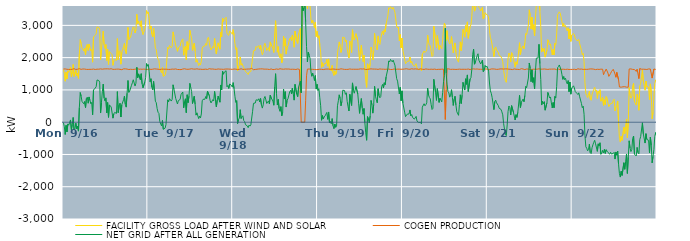
| Category | FACILITY GROSS LOAD AFTER WIND AND SOLAR | COGEN PRODUCTION | NET GRID AFTER ALL GENERATION |
|---|---|---|---|
|  Mon  9/16 | 1635 | 1648 | -13 |
|  Mon  9/16 | 1512 | 1654 | -142 |
|  Mon  9/16 | 1269 | 1650 | -381 |
|  Mon  9/16 | 1549 | 1647 | -98 |
|  Mon  9/16 | 1337 | 1639 | -302 |
|  Mon  9/16 | 1593 | 1647 | -54 |
|  Mon  9/16 | 1542 | 1635 | -93 |
|  Mon  9/16 | 1534 | 1640 | -106 |
|  Mon  9/16 | 1702 | 1633 | 69 |
|  Mon  9/16 | 1405 | 1639 | -234 |
|  Mon  9/16 | 1570 | 1639 | -69 |
|  Mon  9/16 | 1789 | 1643 | 146 |
|  Mon  9/16 | 1416 | 1657 | -241 |
|  Mon  9/16 | 1430 | 1639 | -209 |
|  Mon  9/16 | 1604 | 1634 | -30 |
|  Mon  9/16 | 1434 | 1642 | -208 |
|  Mon  9/16 | 1516 | 1641 | -125 |
|  Mon  9/16 | 1357 | 1634 | -277 |
|  Mon  9/16 | 2112 | 1658 | 454 |
|  Mon  9/16 | 2558 | 1640 | 918 |
|  Mon  9/16 | 2441 | 1637 | 804 |
|  Mon  9/16 | 2297 | 1653 | 644 |
|  Mon  9/16 | 2287 | 1648 | 639 |
|  Mon  9/16 | 2205 | 1635 | 570 |
|  Mon  9/16 | 2286 | 1646 | 640 |
|  Mon  9/16 | 2090 | 1638 | 452 |
|  Mon  9/16 | 2374 | 1636 | 738 |
|  Mon  9/16 | 2413 | 1638 | 775 |
|  Mon  9/16 | 2223 | 1635 | 588 |
|  Mon  9/16 | 2420 | 1638 | 782 |
|  Mon  9/16 | 2309 | 1638 | 671 |
|  Mon  9/16 | 2213 | 1642 | 571 |
|  Mon  9/16 | 2251 | 1638 | 613 |
|  Mon  9/16 | 1859 | 1630 | 229 |
|  Mon  9/16 | 2643 | 1646 | 997 |
|  Mon  9/16 | 2626 | 1638 | 988 |
|  Mon  9/16 | 2691 | 1633 | 1058 |
|  Mon  9/16 | 2742 | 1644 | 1098 |
|  Mon  9/16 | 2951 | 1643 | 1308 |
|  Mon  9/16 | 2958 | 1640 | 1318 |
|  Mon  9/16 | 2932 | 1642 | 1290 |
|  Mon  9/16 | 2885 | 1643 | 1242 |
|  Mon  9/16 | 1935 | 1651 | 284 |
|  Mon  9/16 | 2251 | 1639 | 612 |
|  Mon  9/16 | 2583 | 1642 | 941 |
|  Mon  9/16 | 2820 | 1641 | 1179 |
|  Mon  9/16 | 2399 | 1650 | 749 |
|  Mon  9/16 | 2287 | 1633 | 654 |
|  Mon  9/16 | 2406 | 1652 | 754 |
|  Mon  9/16 | 1914 | 1627 | 287 |
|  Mon  9/16 | 2262 | 1653 | 609 |
|  Mon  9/16 | 1790 | 1640 | 150 |
|  Mon  9/16 | 2183 | 1647 | 536 |
|  Mon  9/16 | 2206 | 1654 | 552 |
|  Mon  9/16 | 2127 | 1656 | 471 |
|  Mon  9/16 | 2092 | 1639 | 453 |
|  Mon  9/16 | 1762 | 1637 | 125 |
|  Mon  9/16 | 1904 | 1646 | 258 |
|  Mon  9/16 | 1943 | 1639 | 304 |
|  Mon  9/16 | 1921 | 1635 | 286 |
|  Mon  9/16 | 1913 | 1643 | 270 |
|  Mon  9/16 | 2591 | 1644 | 947 |
|  Mon  9/16 | 1941 | 1645 | 296 |
|  Mon  9/16 | 2190 | 1660 | 530 |
|  Mon  9/16 | 2224 | 1638 | 586 |
|  Mon  9/16 | 1796 | 1636 | 160 |
|  Mon  9/16 | 2166 | 1627 | 539 |
|  Mon  9/16 | 2156 | 1641 | 515 |
|  Mon  9/16 | 2345 | 1651 | 694 |
|  Mon  9/16 | 2442 | 1635 | 807 |
|  Mon  9/16 | 2205 | 1652 | 553 |
|  Mon  9/16 | 2121 | 1654 | 467 |
|  Mon  9/16 | 2543 | 1645 | 898 |
|  Mon  9/16 | 2936 | 1645 | 1291 |
|  Mon  9/16 | 2556 | 1632 | 924 |
|  Mon  9/16 | 2608 | 1638 | 970 |
|  Mon  9/16 | 2639 | 1640 | 999 |
|  Mon  9/16 | 2778 | 1634 | 1144 |
|  Mon  9/16 | 2855 | 1634 | 1221 |
|  Mon  9/16 | 2957 | 1643 | 1314 |
|  Mon  9/16 | 2922 | 1637 | 1285 |
|  Mon  9/16 | 2763 | 1643 | 1120 |
|  Mon  9/16 | 2854 | 1647 | 1207 |
|  Mon  9/16 | 3343 | 1643 | 1700 |
|  Mon  9/16 | 3051 | 1673 | 1378 |
|  Mon  9/16 | 3136 | 1639 | 1497 |
|  Mon  9/16 | 3154 | 1640 | 1514 |
|  Mon  9/16 | 2962 | 1644 | 1318 |
|  Mon  9/16 | 3141 | 1639 | 1502 |
|  Mon  9/16 | 2827 | 1640 | 1187 |
|  Mon  9/16 | 2710 | 1645 | 1065 |
|  Mon  9/16 | 2720 | 1645 | 1075 |
|  Mon  9/16 | 2881 | 1640 | 1241 |
|  Mon  9/16 | 3022 | 1638 | 1384 |
|  Mon  9/16 | 3458 | 1642 | 1816 |
|  Mon  9/16 | 3369 | 1633 | 1736 |
|  Tue  9/17 | 3415 | 1630 | 1785 |
|  Tue  9/17 | 3208 | 1646 | 1562 |
|  Tue  9/17 | 2893 | 1639 | 1254 |
|  Tue  9/17 | 2981 | 1635 | 1346 |
|  Tue  9/17 | 2731 | 1645 | 1086 |
|  Tue  9/17 | 2648 | 1642 | 1006 |
|  Tue  9/17 | 2908 | 1646 | 1262 |
|  Tue  9/17 | 2622 | 1653 | 969 |
|  Tue  9/17 | 2291 | 1640 | 651 |
|  Tue  9/17 | 2251 | 1647 | 604 |
|  Tue  9/17 | 2056 | 1634 | 422 |
|  Tue  9/17 | 1951 | 1643 | 308 |
|  Tue  9/17 | 1912 | 1642 | 270 |
|  Tue  9/17 | 1656 | 1633 | 23 |
|  Tue  9/17 | 1633 | 1637 | -4 |
|  Tue  9/17 | 1527 | 1643 | -116 |
|  Tue  9/17 | 1696 | 1642 | 54 |
|  Tue  9/17 | 1423 | 1643 | -220 |
|  Tue  9/17 | 1435 | 1640 | -205 |
|  Tue  9/17 | 1457 | 1642 | -185 |
|  Tue  9/17 | 1579 | 1651 | -72 |
|  Tue  9/17 | 1599 | 1641 | -42 |
|  Tue  9/17 | 2322 | 1630 | 692 |
|  Tue  9/17 | 2266 | 1635 | 631 |
|  Tue  9/17 | 2377 | 1648 | 729 |
|  Tue  9/17 | 2348 | 1636 | 712 |
|  Tue  9/17 | 2305 | 1651 | 654 |
|  Tue  9/17 | 2353 | 1645 | 708 |
|  Tue  9/17 | 2798 | 1640 | 1158 |
|  Tue  9/17 | 2667 | 1642 | 1025 |
|  Tue  9/17 | 2668 | 1650 | 1018 |
|  Tue  9/17 | 2387 | 1650 | 737 |
|  Tue  9/17 | 2406 | 1644 | 762 |
|  Tue  9/17 | 2196 | 1633 | 563 |
|  Tue  9/17 | 2307 | 1638 | 669 |
|  Tue  9/17 | 2308 | 1631 | 677 |
|  Tue  9/17 | 2350 | 1646 | 704 |
|  Tue  9/17 | 2483 | 1629 | 854 |
|  Tue  9/17 | 2479 | 1644 | 835 |
|  Tue  9/17 | 2581 | 1646 | 935 |
|  Tue  9/17 | 2076 | 1631 | 445 |
|  Tue  9/17 | 2296 | 1655 | 641 |
|  Tue  9/17 | 2359 | 1634 | 725 |
|  Tue  9/17 | 1936 | 1641 | 295 |
|  Tue  9/17 | 2496 | 1646 | 850 |
|  Tue  9/17 | 2244 | 1639 | 605 |
|  Tue  9/17 | 2453 | 1647 | 806 |
|  Tue  9/17 | 2847 | 1645 | 1202 |
|  Tue  9/17 | 2711 | 1637 | 1074 |
|  Tue  9/17 | 2605 | 1656 | 949 |
|  Tue  9/17 | 2223 | 1645 | 578 |
|  Tue  9/17 | 2250 | 1645 | 605 |
|  Tue  9/17 | 2443 | 1641 | 802 |
|  Tue  9/17 | 2197 | 1644 | 553 |
|  Tue  9/17 | 1861 | 1642 | 219 |
|  Tue  9/17 | 1942 | 1653 | 289 |
|  Tue  9/17 | 1943 | 1644 | 299 |
|  Tue  9/17 | 1753 | 1642 | 111 |
|  Tue  9/17 | 1832 | 1640 | 192 |
|  Tue  9/17 | 1771 | 1642 | 129 |
|  Tue  9/17 | 1896 | 1642 | 254 |
|  Tue  9/17 | 2300 | 1636 | 664 |
|  Tue  9/17 | 2347 | 1638 | 709 |
|  Tue  9/17 | 2377 | 1638 | 739 |
|  Tue  9/17 | 2362 | 1652 | 710 |
|  Tue  9/17 | 2439 | 1644 | 795 |
|  Tue  9/17 | 2382 | 1652 | 730 |
|  Tue  9/17 | 2593 | 1634 | 959 |
|  Tue  9/17 | 2629 | 1644 | 985 |
|  Tue  9/17 | 2476 | 1658 | 818 |
|  Tue  9/17 | 2313 | 1650 | 663 |
|  Tue  9/17 | 2243 | 1646 | 597 |
|  Tue  9/17 | 2262 | 1644 | 618 |
|  Tue  9/17 | 2346 | 1648 | 698 |
|  Tue  9/17 | 2298 | 1637 | 661 |
|  Tue  9/17 | 2593 | 1640 | 953 |
|  Tue  9/17 | 2606 | 1638 | 968 |
|  Tue  9/17 | 2112 | 1637 | 475 |
|  Tue  9/17 | 2334 | 1650 | 684 |
|  Tue  9/17 | 2458 | 1649 | 809 |
|  Tue  9/17 | 2437 | 1635 | 802 |
|  Tue  9/17 | 2263 | 1643 | 620 |
|  Tue  9/17 | 2789 | 1636 | 1153 |
|  Tue  9/17 | 2639 | 1642 | 997 |
|  Tue  9/17 | 3223 | 1644 | 1579 |
|  Tue  9/17 | 3123 | 1637 | 1486 |
|  Tue  9/17 | 3192 | 1641 | 1551 |
|  Tue  9/17 | 3170 | 1645 | 1525 |
|  Tue  9/17 | 3249 | 1656 | 1593 |
|  Tue  9/17 | 2744 | 1647 | 1097 |
|  Tue  9/17 | 2768 | 1633 | 1135 |
|  Tue  9/17 | 2690 | 1645 | 1045 |
|  Tue  9/17 | 2824 | 1642 | 1182 |
|  Tue  9/17 | 2798 | 1642 | 1156 |
|  Tue  9/17 | 2779 | 1633 | 1146 |
|  Tue  9/17 | 2724 | 1637 | 1087 |
|  Wed  9/18 | 2868 | 1642 | 1226 |
|  Wed  9/18 | 2689 | 1647 | 1042 |
|  Wed  9/18 | 2442 | 1639 | 803 |
|  Wed  9/18 | 2254 | 1642 | 612 |
|  Wed  9/18 | 2306 | 1637 | 669 |
|  Wed  9/18 | 1591 | 1635 | -44 |
|  Wed  9/18 | 1713 | 1635 | 78 |
|  Wed  9/18 | 1767 | 1638 | 129 |
|  Wed  9/18 | 2021 | 1634 | 387 |
|  Wed  9/18 | 1767 | 1655 | 112 |
|  Wed  9/18 | 1816 | 1650 | 166 |
|  Wed  9/18 | 1834 | 1636 | 198 |
|  Wed  9/18 | 1686 | 1636 | 50 |
|  Wed  9/18 | 1656 | 1640 | 16 |
|  Wed  9/18 | 1569 | 1648 | -79 |
|  Wed  9/18 | 1571 | 1643 | -72 |
|  Wed  9/18 | 1522 | 1637 | -115 |
|  Wed  9/18 | 1477 | 1647 | -170 |
|  Wed  9/18 | 1551 | 1642 | -91 |
|  Wed  9/18 | 1525 | 1647 | -122 |
|  Wed  9/18 | 1571 | 1653 | -82 |
|  Wed  9/18 | 1591 | 1667 | -76 |
|  Wed  9/18 | 1982 | 1644 | 338 |
|  Wed  9/18 | 2210 | 1626 | 584 |
|  Wed  9/18 | 2224 | 1645 | 579 |
|  Wed  9/18 | 2228 | 1634 | 594 |
|  Wed  9/18 | 2344 | 1651 | 693 |
|  Wed  9/18 | 2312 | 1642 | 670 |
|  Wed  9/18 | 2326 | 1646 | 680 |
|  Wed  9/18 | 2374 | 1648 | 726 |
|  Wed  9/18 | 2268 | 1641 | 627 |
|  Wed  9/18 | 2385 | 1651 | 734 |
|  Wed  9/18 | 2197 | 1659 | 538 |
|  Wed  9/18 | 2088 | 1652 | 436 |
|  Wed  9/18 | 2172 | 1636 | 536 |
|  Wed  9/18 | 2381 | 1644 | 737 |
|  Wed  9/18 | 2446 | 1649 | 797 |
|  Wed  9/18 | 2335 | 1644 | 691 |
|  Wed  9/18 | 2222 | 1641 | 581 |
|  Wed  9/18 | 2239 | 1642 | 597 |
|  Wed  9/18 | 2310 | 1650 | 660 |
|  Wed  9/18 | 2200 | 1632 | 568 |
|  Wed  9/18 | 2487 | 1648 | 839 |
|  Wed  9/18 | 2401 | 1650 | 751 |
|  Wed  9/18 | 2406 | 1634 | 772 |
|  Wed  9/18 | 2284 | 1629 | 655 |
|  Wed  9/18 | 2160 | 1635 | 525 |
|  Wed  9/18 | 2728 | 1635 | 1093 |
|  Wed  9/18 | 3143 | 1641 | 1502 |
|  Wed  9/18 | 2538 | 1648 | 890 |
|  Wed  9/18 | 2169 | 1638 | 531 |
|  Wed  9/18 | 2342 | 1637 | 705 |
|  Wed  9/18 | 2061 | 1639 | 422 |
|  Wed  9/18 | 1994 | 1656 | 338 |
|  Wed  9/18 | 2121 | 1640 | 481 |
|  Wed  9/18 | 1843 | 1645 | 198 |
|  Wed  9/18 | 1940 | 1631 | 309 |
|  Wed  9/18 | 2666 | 1641 | 1025 |
|  Wed  9/18 | 2357 | 1640 | 717 |
|  Wed  9/18 | 2594 | 1649 | 945 |
|  Wed  9/18 | 2110 | 1641 | 469 |
|  Wed  9/18 | 2324 | 1646 | 678 |
|  Wed  9/18 | 2364 | 1638 | 726 |
|  Wed  9/18 | 2359 | 1647 | 712 |
|  Wed  9/18 | 2592 | 1648 | 944 |
|  Wed  9/18 | 2624 | 1638 | 986 |
|  Wed  9/18 | 2531 | 1651 | 880 |
|  Wed  9/18 | 2698 | 1641 | 1057 |
|  Wed  9/18 | 2533 | 1651 | 882 |
|  Wed  9/18 | 2322 | 1639 | 683 |
|  Wed  9/18 | 2823 | 1652 | 1171 |
|  Wed  9/18 | 2805 | 1632 | 1173 |
|  Wed  9/18 | 2509 | 1645 | 864 |
|  Wed  9/18 | 2438 | 1649 | 789 |
|  Wed  9/18 | 2732 | 1644 | 1088 |
|  Wed  9/18 | 2706 | 1635 | 1071 |
|  Wed  9/18 | 2902 | 1633 | 1269 |
|  Wed  9/18 | 911 | 0 | 911 |
|  Wed  9/18 | 3665 | 0 | 3665 |
|  Wed  9/18 | 3449 | 0 | 3449 |
|  Wed  9/18 | 3541 | 0 | 3541 |
|  Wed  9/18 | 3788 | 0 | 3788 |
|  Wed  9/18 | 3774 | 664 | 3110 |
|  Wed  9/18 | 3783 | 1436 | 2347 |
|  Wed  9/18 | 3515 | 1645 | 1870 |
|  Wed  9/18 | 3806 | 1639 | 2167 |
|  Wed  9/18 | 3717 | 1647 | 2070 |
|  Wed  9/18 | 3614 | 1634 | 1980 |
|  Wed  9/18 | 3199 | 1640 | 1559 |
|  Wed  9/18 | 3070 | 1647 | 1423 |
|  Wed  9/18 | 3158 | 1637 | 1521 |
|  Wed  9/18 | 3055 | 1636 | 1419 |
|  Wed  9/18 | 2924 | 1633 | 1291 |
|  Wed  9/18 | 3096 | 1653 | 1443 |
|  Wed  9/18 | 2654 | 1628 | 1026 |
|  Wed  9/18 | 2818 | 1646 | 1172 |
|  Thu  9/19 | 2614 | 1633 | 981 |
|  Thu  9/19 | 2680 | 1645 | 1035 |
|  Thu  9/19 | 2398 | 1642 | 756 |
|  Thu  9/19 | 2162 | 1654 | 508 |
|  Thu  9/19 | 1697 | 1639 | 58 |
|  Thu  9/19 | 1844 | 1638 | 206 |
|  Thu  9/19 | 1728 | 1630 | 98 |
|  Thu  9/19 | 1811 | 1647 | 164 |
|  Thu  9/19 | 1839 | 1643 | 196 |
|  Thu  9/19 | 1827 | 1650 | 177 |
|  Thu  9/19 | 1948 | 1646 | 302 |
|  Thu  9/19 | 1736 | 1648 | 88 |
|  Thu  9/19 | 1961 | 1645 | 316 |
|  Thu  9/19 | 1625 | 1650 | -25 |
|  Thu  9/19 | 1662 | 1639 | 23 |
|  Thu  9/19 | 1589 | 1636 | -47 |
|  Thu  9/19 | 1757 | 1646 | 111 |
|  Thu  9/19 | 1529 | 1641 | -112 |
|  Thu  9/19 | 1447 | 1646 | -199 |
|  Thu  9/19 | 1590 | 1647 | -57 |
|  Thu  9/19 | 1479 | 1638 | -159 |
|  Thu  9/19 | 1523 | 1643 | -120 |
|  Thu  9/19 | 2147 | 1638 | 509 |
|  Thu  9/19 | 2308 | 1644 | 664 |
|  Thu  9/19 | 2487 | 1639 | 848 |
|  Thu  9/19 | 2368 | 1632 | 736 |
|  Thu  9/19 | 2161 | 1654 | 507 |
|  Thu  9/19 | 2285 | 1643 | 642 |
|  Thu  9/19 | 2635 | 1645 | 990 |
|  Thu  9/19 | 2631 | 1630 | 1001 |
|  Thu  9/19 | 2616 | 1636 | 980 |
|  Thu  9/19 | 2493 | 1630 | 863 |
|  Thu  9/19 | 2546 | 1635 | 911 |
|  Thu  9/19 | 2274 | 1629 | 645 |
|  Thu  9/19 | 2116 | 1637 | 479 |
|  Thu  9/19 | 1988 | 1641 | 347 |
|  Thu  9/19 | 2511 | 1649 | 862 |
|  Thu  9/19 | 2478 | 1642 | 836 |
|  Thu  9/19 | 2159 | 1640 | 519 |
|  Thu  9/19 | 2864 | 1647 | 1217 |
|  Thu  9/19 | 2632 | 1641 | 991 |
|  Thu  9/19 | 2542 | 1645 | 897 |
|  Thu  9/19 | 2564 | 1640 | 924 |
|  Thu  9/19 | 2744 | 1640 | 1104 |
|  Thu  9/19 | 2743 | 1640 | 1103 |
|  Thu  9/19 | 2524 | 1651 | 873 |
|  Thu  9/19 | 2208 | 1641 | 567 |
|  Thu  9/19 | 1908 | 1634 | 274 |
|  Thu  9/19 | 2217 | 1652 | 565 |
|  Thu  9/19 | 2384 | 1651 | 733 |
|  Thu  9/19 | 2090 | 1646 | 444 |
|  Thu  9/19 | 1877 | 1630 | 247 |
|  Thu  9/19 | 2075 | 1651 | 424 |
|  Thu  9/19 | 1628 | 1648 | -20 |
|  Thu  9/19 | 1301 | 1631 | -330 |
|  Thu  9/19 | 1079 | 1640 | -561 |
|  Thu  9/19 | 1809 | 1637 | 172 |
|  Thu  9/19 | 1736 | 1634 | 102 |
|  Thu  9/19 | 1626 | 1646 | -20 |
|  Thu  9/19 | 1828 | 1635 | 193 |
|  Thu  9/19 | 2326 | 1652 | 674 |
|  Thu  9/19 | 2181 | 1641 | 540 |
|  Thu  9/19 | 1926 | 1646 | 280 |
|  Thu  9/19 | 2194 | 1647 | 547 |
|  Thu  9/19 | 2755 | 1645 | 1110 |
|  Thu  9/19 | 2455 | 1650 | 805 |
|  Thu  9/19 | 2339 | 1644 | 695 |
|  Thu  9/19 | 2242 | 1640 | 602 |
|  Thu  9/19 | 2673 | 1636 | 1037 |
|  Thu  9/19 | 2465 | 1640 | 825 |
|  Thu  9/19 | 2407 | 1650 | 757 |
|  Thu  9/19 | 2436 | 1641 | 795 |
|  Thu  9/19 | 2747 | 1643 | 1104 |
|  Thu  9/19 | 2820 | 1650 | 1170 |
|  Thu  9/19 | 2703 | 1643 | 1060 |
|  Thu  9/19 | 2867 | 1644 | 1223 |
|  Thu  9/19 | 2796 | 1638 | 1158 |
|  Thu  9/19 | 3042 | 1643 | 1399 |
|  Thu  9/19 | 3029 | 1643 | 1386 |
|  Thu  9/19 | 3287 | 1635 | 1652 |
|  Thu  9/19 | 3545 | 1646 | 1899 |
|  Thu  9/19 | 3513 | 1647 | 1866 |
|  Thu  9/19 | 3577 | 1633 | 1944 |
|  Thu  9/19 | 3550 | 1643 | 1907 |
|  Thu  9/19 | 3501 | 1632 | 1869 |
|  Thu  9/19 | 3559 | 1637 | 1922 |
|  Thu  9/19 | 3491 | 1648 | 1843 |
|  Thu  9/19 | 3404 | 1639 | 1765 |
|  Thu  9/19 | 3393 | 1637 | 1756 |
|  Thu  9/19 | 2980 | 1632 | 1348 |
|  Thu  9/19 | 2916 | 1644 | 1272 |
|  Thu  9/19 | 2950 | 1649 | 1301 |
|  Thu  9/19 | 2518 | 1643 | 875 |
|  Thu  9/19 | 2717 | 1638 | 1079 |
|  Thu  9/19 | 2304 | 1640 | 664 |
|  Thu  9/19 | 2605 | 1634 | 971 |
|  Fri  9/20 | 2236 | 1641 | 595 |
|  Fri  9/20 | 2216 | 1643 | 573 |
|  Fri  9/20 | 1959 | 1647 | 312 |
|  Fri  9/20 | 1814 | 1642 | 172 |
|  Fri  9/20 | 1835 | 1656 | 179 |
|  Fri  9/20 | 1887 | 1637 | 250 |
|  Fri  9/20 | 1916 | 1643 | 273 |
|  Fri  9/20 | 1893 | 1638 | 255 |
|  Fri  9/20 | 2018 | 1639 | 379 |
|  Fri  9/20 | 1832 | 1635 | 197 |
|  Fri  9/20 | 1891 | 1655 | 236 |
|  Fri  9/20 | 1786 | 1641 | 145 |
|  Fri  9/20 | 1774 | 1645 | 129 |
|  Fri  9/20 | 1733 | 1638 | 95 |
|  Fri  9/20 | 1718 | 1651 | 67 |
|  Fri  9/20 | 1813 | 1634 | 179 |
|  Fri  9/20 | 1678 | 1647 | 31 |
|  Fri  9/20 | 1667 | 1654 | 13 |
|  Fri  9/20 | 1625 | 1637 | -12 |
|  Fri  9/20 | 1597 | 1618 | -21 |
|  Fri  9/20 | 1653 | 1652 | 1 |
|  Fri  9/20 | 1595 | 1647 | -52 |
|  Fri  9/20 | 2108 | 1641 | 467 |
|  Fri  9/20 | 2091 | 1642 | 449 |
|  Fri  9/20 | 2206 | 1634 | 572 |
|  Fri  9/20 | 2159 | 1651 | 508 |
|  Fri  9/20 | 2190 | 1650 | 540 |
|  Fri  9/20 | 2238 | 1637 | 601 |
|  Fri  9/20 | 2697 | 1641 | 1056 |
|  Fri  9/20 | 2482 | 1638 | 844 |
|  Fri  9/20 | 2399 | 1637 | 762 |
|  Fri  9/20 | 2365 | 1640 | 725 |
|  Fri  9/20 | 2185 | 1643 | 542 |
|  Fri  9/20 | 2032 | 1639 | 393 |
|  Fri  9/20 | 2067 | 1637 | 430 |
|  Fri  9/20 | 2975 | 1647 | 1328 |
|  Fri  9/20 | 2955 | 1645 | 1310 |
|  Fri  9/20 | 2570 | 1650 | 920 |
|  Fri  9/20 | 2306 | 1631 | 675 |
|  Fri  9/20 | 2682 | 1643 | 1039 |
|  Fri  9/20 | 2694 | 1638 | 1056 |
|  Fri  9/20 | 2252 | 1638 | 614 |
|  Fri  9/20 | 2380 | 1638 | 742 |
|  Fri  9/20 | 2396 | 1649 | 747 |
|  Fri  9/20 | 2271 | 1642 | 629 |
|  Fri  9/20 | 2557 | 1644 | 913 |
|  Fri  9/20 | 2901 | 1645 | 1256 |
|  Fri  9/20 | 3071 | 1635 | 1436 |
|  Fri  9/20 | 2994 | 84 | 2910 |
|  Fri  9/20 | 2528 | 1014 | 1514 |
|  Fri  9/20 | 2835 | 1654 | 1181 |
|  Fri  9/20 | 2575 | 1627 | 948 |
|  Fri  9/20 | 2559 | 1650 | 909 |
|  Fri  9/20 | 2423 | 1648 | 775 |
|  Fri  9/20 | 2471 | 1636 | 835 |
|  Fri  9/20 | 2653 | 1647 | 1006 |
|  Fri  9/20 | 2411 | 1640 | 771 |
|  Fri  9/20 | 2148 | 1629 | 519 |
|  Fri  9/20 | 2351 | 1638 | 713 |
|  Fri  9/20 | 2455 | 1651 | 804 |
|  Fri  9/20 | 2167 | 1634 | 533 |
|  Fri  9/20 | 1965 | 1640 | 325 |
|  Fri  9/20 | 1967 | 1638 | 329 |
|  Fri  9/20 | 1859 | 1647 | 212 |
|  Fri  9/20 | 2192 | 1644 | 548 |
|  Fri  9/20 | 2489 | 1640 | 849 |
|  Fri  9/20 | 2216 | 1638 | 578 |
|  Fri  9/20 | 2477 | 1640 | 837 |
|  Fri  9/20 | 2875 | 1640 | 1235 |
|  Fri  9/20 | 2753 | 1650 | 1103 |
|  Fri  9/20 | 2634 | 1639 | 995 |
|  Fri  9/20 | 2994 | 1649 | 1345 |
|  Fri  9/20 | 2811 | 1638 | 1173 |
|  Fri  9/20 | 3108 | 1644 | 1464 |
|  Fri  9/20 | 2599 | 1647 | 952 |
|  Fri  9/20 | 2597 | 1631 | 966 |
|  Fri  9/20 | 2970 | 1630 | 1340 |
|  Fri  9/20 | 3013 | 1637 | 1376 |
|  Fri  9/20 | 3279 | 1645 | 1634 |
|  Fri  9/20 | 3738 | 1635 | 2103 |
|  Fri  9/20 | 3913 | 1651 | 2262 |
|  Fri  9/20 | 3441 | 1644 | 1797 |
|  Fri  9/20 | 3500 | 1644 | 1856 |
|  Fri  9/20 | 3472 | 1633 | 1839 |
|  Fri  9/20 | 3707 | 1648 | 2059 |
|  Fri  9/20 | 3757 | 1637 | 2120 |
|  Fri  9/20 | 3560 | 1640 | 1920 |
|  Fri  9/20 | 3528 | 1625 | 1903 |
|  Fri  9/20 | 3443 | 1641 | 1802 |
|  Fri  9/20 | 3457 | 1646 | 1811 |
|  Fri  9/20 | 3562 | 1639 | 1923 |
|  Fri  9/20 | 3198 | 1635 | 1563 |
|  Fri  9/20 | 3238 | 1640 | 1598 |
|  Fri  9/20 | 3394 | 1634 | 1760 |
|  Fri  9/20 | 3352 | 1650 | 1702 |
|  Fri  9/20 | 3380 | 1645 | 1735 |
|  Sat  9/21 | 3311 | 1642 | 1669 |
|  Sat  9/21 | 3231 | 1649 | 1582 |
|  Sat  9/21 | 2844 | 1630 | 1214 |
|  Sat  9/21 | 2621 | 1651 | 970 |
|  Sat  9/21 | 2545 | 1649 | 896 |
|  Sat  9/21 | 2393 | 1631 | 762 |
|  Sat  9/21 | 2386 | 1650 | 736 |
|  Sat  9/21 | 2033 | 1643 | 390 |
|  Sat  9/21 | 2284 | 1646 | 638 |
|  Sat  9/21 | 2332 | 1650 | 682 |
|  Sat  9/21 | 2237 | 1636 | 601 |
|  Sat  9/21 | 2234 | 1636 | 598 |
|  Sat  9/21 | 2152 | 1640 | 512 |
|  Sat  9/21 | 2063 | 1634 | 429 |
|  Sat  9/21 | 2066 | 1650 | 416 |
|  Sat  9/21 | 2037 | 1640 | 397 |
|  Sat  9/21 | 1971 | 1650 | 321 |
|  Sat  9/21 | 1874 | 1647 | 227 |
|  Sat  9/21 | 1598 | 1645 | -47 |
|  Sat  9/21 | 1429 | 1648 | -219 |
|  Sat  9/21 | 1284 | 1651 | -367 |
|  Sat  9/21 | 1234 | 1650 | -416 |
|  Sat  9/21 | 1565 | 1650 | -85 |
|  Sat  9/21 | 1981 | 1649 | 332 |
|  Sat  9/21 | 2143 | 1642 | 501 |
|  Sat  9/21 | 2084 | 1633 | 451 |
|  Sat  9/21 | 1863 | 1639 | 224 |
|  Sat  9/21 | 2155 | 1642 | 513 |
|  Sat  9/21 | 2124 | 1630 | 494 |
|  Sat  9/21 | 1970 | 1655 | 315 |
|  Sat  9/21 | 1965 | 1649 | 316 |
|  Sat  9/21 | 1703 | 1636 | 67 |
|  Sat  9/21 | 1872 | 1640 | 232 |
|  Sat  9/21 | 1792 | 1643 | 149 |
|  Sat  9/21 | 1940 | 1637 | 303 |
|  Sat  9/21 | 1951 | 1642 | 309 |
|  Sat  9/21 | 2462 | 1631 | 831 |
|  Sat  9/21 | 2096 | 1645 | 451 |
|  Sat  9/21 | 2275 | 1658 | 617 |
|  Sat  9/21 | 2286 | 1650 | 636 |
|  Sat  9/21 | 2363 | 1647 | 716 |
|  Sat  9/21 | 2275 | 1642 | 633 |
|  Sat  9/21 | 2456 | 1629 | 827 |
|  Sat  9/21 | 2749 | 1636 | 1113 |
|  Sat  9/21 | 2715 | 1648 | 1067 |
|  Sat  9/21 | 2699 | 1643 | 1056 |
|  Sat  9/21 | 3012 | 1644 | 1368 |
|  Sat  9/21 | 3482 | 1648 | 1834 |
|  Sat  9/21 | 3307 | 1637 | 1670 |
|  Sat  9/21 | 2888 | 1634 | 1254 |
|  Sat  9/21 | 3256 | 1635 | 1621 |
|  Sat  9/21 | 2869 | 1637 | 1232 |
|  Sat  9/21 | 3020 | 1642 | 1378 |
|  Sat  9/21 | 2670 | 1639 | 1031 |
|  Sat  9/21 | 3235 | 1639 | 1596 |
|  Sat  9/21 | 3637 | 1653 | 1984 |
|  Sat  9/21 | 3631 | 1643 | 1988 |
|  Sat  9/21 | 3634 | 1644 | 1990 |
|  Sat  9/21 | 4065 | 1653 | 2412 |
|  Sat  9/21 | 3455 | 1640 | 1815 |
|  Sat  9/21 | 2967 | 1643 | 1324 |
|  Sat  9/21 | 2173 | 1642 | 531 |
|  Sat  9/21 | 2288 | 1644 | 644 |
|  Sat  9/21 | 2196 | 1625 | 571 |
|  Sat  9/21 | 2283 | 1648 | 635 |
|  Sat  9/21 | 2017 | 1645 | 372 |
|  Sat  9/21 | 2024 | 1642 | 382 |
|  Sat  9/21 | 2230 | 1627 | 603 |
|  Sat  9/21 | 2556 | 1635 | 921 |
|  Sat  9/21 | 2494 | 1654 | 840 |
|  Sat  9/21 | 2392 | 1644 | 748 |
|  Sat  9/21 | 2427 | 1645 | 782 |
|  Sat  9/21 | 2241 | 1644 | 597 |
|  Sat  9/21 | 2086 | 1644 | 442 |
|  Sat  9/21 | 2254 | 1645 | 609 |
|  Sat  9/21 | 2086 | 1638 | 448 |
|  Sat  9/21 | 2448 | 1647 | 801 |
|  Sat  9/21 | 2403 | 1655 | 748 |
|  Sat  9/21 | 2739 | 1627 | 1112 |
|  Sat  9/21 | 3329 | 1643 | 1686 |
|  Sat  9/21 | 3367 | 1644 | 1723 |
|  Sat  9/21 | 3419 | 1646 | 1773 |
|  Sat  9/21 | 3378 | 1632 | 1746 |
|  Sat  9/21 | 3253 | 1638 | 1615 |
|  Sat  9/21 | 3112 | 1641 | 1471 |
|  Sat  9/21 | 2964 | 1637 | 1327 |
|  Sat  9/21 | 3055 | 1640 | 1415 |
|  Sat  9/21 | 2957 | 1640 | 1317 |
|  Sat  9/21 | 2996 | 1634 | 1362 |
|  Sat  9/21 | 2888 | 1635 | 1253 |
|  Sat  9/21 | 2828 | 1642 | 1186 |
|  Sat  9/21 | 2927 | 1638 | 1289 |
|  Sat  9/21 | 2577 | 1633 | 944 |
|  Sat  9/21 | 2887 | 1643 | 1244 |
|  Sat  9/21 | 2503 | 1635 | 868 |
|  Sat  9/21 | 2702 | 1646 | 1056 |
|  Sun  9/22 | 2677 | 1635 | 1042 |
|  Sun  9/22 | 2750 | 1623 | 1127 |
|  Sun  9/22 | 2703 | 1640 | 1063 |
|  Sun  9/22 | 2599 | 1650 | 949 |
|  Sun  9/22 | 2596 | 1625 | 971 |
|  Sun  9/22 | 2522 | 1633 | 889 |
|  Sun  9/22 | 2512 | 1655 | 857 |
|  Sun  9/22 | 2558 | 1647 | 911 |
|  Sun  9/22 | 2431 | 1643 | 788 |
|  Sun  9/22 | 2457 | 1656 | 801 |
|  Sun  9/22 | 2227 | 1646 | 581 |
|  Sun  9/22 | 2086 | 1637 | 449 |
|  Sun  9/22 | 2131 | 1635 | 496 |
|  Sun  9/22 | 1882 | 1637 | 245 |
|  Sun  9/22 | 1219 | 1639 | -420 |
|  Sun  9/22 | 883 | 1646 | -763 |
|  Sun  9/22 | 827 | 1636 | -809 |
|  Sun  9/22 | 765 | 1652 | -887 |
|  Sun  9/22 | 791 | 1642 | -851 |
|  Sun  9/22 | 960 | 1641 | -681 |
|  Sun  9/22 | 708 | 1650 | -942 |
|  Sun  9/22 | 677 | 1651 | -974 |
|  Sun  9/22 | 857 | 1649 | -792 |
|  Sun  9/22 | 942 | 1643 | -701 |
|  Sun  9/22 | 1020 | 1643 | -623 |
|  Sun  9/22 | 1082 | 1643 | -561 |
|  Sun  9/22 | 958 | 1629 | -671 |
|  Sun  9/22 | 990 | 1645 | -655 |
|  Sun  9/22 | 736 | 1640 | -904 |
|  Sun  9/22 | 966 | 1637 | -671 |
|  Sun  9/22 | 897 | 1635 | -738 |
|  Sun  9/22 | 1007 | 1644 | -637 |
|  Sun  9/22 | 649 | 1643 | -994 |
|  Sun  9/22 | 681 | 1638 | -957 |
|  Sun  9/22 | 769 | 1641 | -872 |
|  Sun  9/22 | 519 | 1471 | -952 |
|  Sun  9/22 | 694 | 1537 | -843 |
|  Sun  9/22 | 542 | 1510 | -968 |
|  Sun  9/22 | 793 | 1646 | -853 |
|  Sun  9/22 | 751 | 1649 | -898 |
|  Sun  9/22 | 586 | 1523 | -937 |
|  Sun  9/22 | 482 | 1419 | -937 |
|  Sun  9/22 | 456 | 1447 | -991 |
|  Sun  9/22 | 578 | 1510 | -932 |
|  Sun  9/22 | 581 | 1569 | -988 |
|  Sun  9/22 | 588 | 1553 | -965 |
|  Sun  9/22 | 671 | 1639 | -968 |
|  Sun  9/22 | 713 | 1647 | -934 |
|  Sun  9/22 | 350 | 1493 | -1143 |
|  Sun  9/22 | 469 | 1392 | -923 |
|  Sun  9/22 | 520 | 1543 | -1023 |
|  Sun  9/22 | 656 | 1550 | -894 |
|  Sun  9/22 | 7 | 1311 | -1304 |
|  Sun  9/22 | -504 | 1090 | -1594 |
|  Sun  9/22 | -616 | 1085 | -1701 |
|  Sun  9/22 | -437 | 1085 | -1522 |
|  Sun  9/22 | -563 | 1087 | -1650 |
|  Sun  9/22 | -545 | 1096 | -1641 |
|  Sun  9/22 | -160 | 1097 | -1257 |
|  Sun  9/22 | -360 | 1100 | -1460 |
|  Sun  9/22 | -133 | 1092 | -1225 |
|  Sun  9/22 | 100 | 1085 | -985 |
|  Sun  9/22 | -490 | 1098 | -1588 |
|  Sun  9/22 | -3 | 1084 | -1087 |
|  Sun  9/22 | 1072 | 1649 | -577 |
|  Sun  9/22 | 839 | 1641 | -802 |
|  Sun  9/22 | 740 | 1650 | -910 |
|  Sun  9/22 | 782 | 1627 | -845 |
|  Sun  9/22 | 1133 | 1635 | -502 |
|  Sun  9/22 | 1202 | 1631 | -429 |
|  Sun  9/22 | 640 | 1632 | -992 |
|  Sun  9/22 | 621 | 1603 | -982 |
|  Sun  9/22 | 525 | 1572 | -1047 |
|  Sun  9/22 | 863 | 1646 | -783 |
|  Sun  9/22 | 701 | 1641 | -940 |
|  Sun  9/22 | 370 | 1351 | -981 |
|  Sun  9/22 | 1120 | 1661 | -541 |
|  Sun  9/22 | 1203 | 1652 | -449 |
|  Sun  9/22 | 1198 | 1642 | -444 |
|  Sun  9/22 | 1620 | 1638 | -18 |
|  Sun  9/22 | 1280 | 1642 | -362 |
|  Sun  9/22 | 1253 | 1640 | -387 |
|  Sun  9/22 | 991 | 1638 | -647 |
|  Sun  9/22 | 1275 | 1631 | -356 |
|  Sun  9/22 | 1098 | 1633 | -535 |
|  Sun  9/22 | 1119 | 1642 | -523 |
|  Sun  9/22 | 1087 | 1649 | -562 |
|  Sun  9/22 | 691 | 1641 | -950 |
|  Sun  9/22 | 1186 | 1647 | -461 |
|  Sun  9/22 | 939 | 1646 | -707 |
|  Sun  9/22 | 107 | 1367 | -1260 |
|  Sun  9/22 | 304 | 1365 | -1061 |
|  Sun  9/22 | 806 | 1648 | -842 |
|  Sun  9/22 | 1196 | 1635 | -439 |
|  Sun  9/22 | 1313 | 1635 | -322 |
|  Sun  9/22 | 1231 | 1652 | -421 |